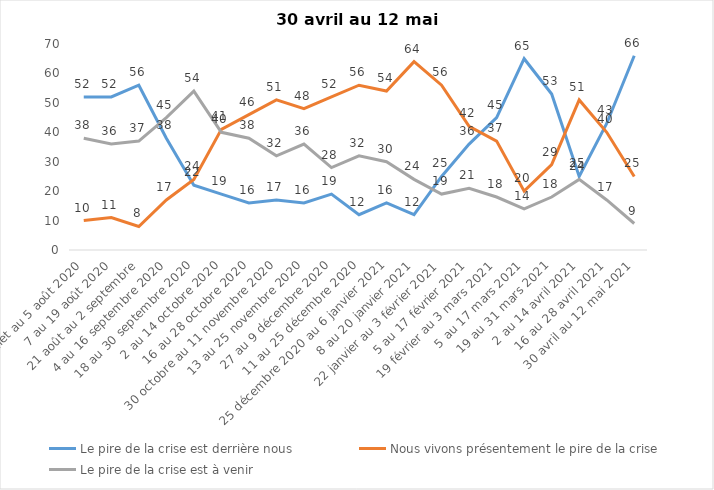
| Category | Le pire de la crise est derrière nous | Nous vivons présentement le pire de la crise | Le pire de la crise est à venir |
|---|---|---|---|
| 24 juillet au 5 août 2020 | 52 | 10 | 38 |
| 7 au 19 août 2020 | 52 | 11 | 36 |
| 21 août au 2 septembre | 56 | 8 | 37 |
| 4 au 16 septembre 2020 | 38 | 17 | 45 |
| 18 au 30 septembre 2020 | 22 | 24 | 54 |
| 2 au 14 octobre 2020 | 19 | 41 | 40 |
| 16 au 28 octobre 2020 | 16 | 46 | 38 |
| 30 octobre au 11 novembre 2020 | 17 | 51 | 32 |
| 13 au 25 novembre 2020 | 16 | 48 | 36 |
| 27 au 9 décembre 2020 | 19 | 52 | 28 |
| 11 au 25 décembre 2020 | 12 | 56 | 32 |
| 25 décembre 2020 au 6 janvier 2021 | 16 | 54 | 30 |
| 8 au 20 janvier 2021 | 12 | 64 | 24 |
| 22 janvier au 3 février 2021 | 25 | 56 | 19 |
| 5 au 17 février 2021 | 36 | 42 | 21 |
| 19 février au 3 mars 2021 | 45 | 37 | 18 |
| 5 au 17 mars 2021 | 65 | 20 | 14 |
| 19 au 31 mars 2021 | 53 | 29 | 18 |
| 2 au 14 avril 2021 | 25 | 51 | 24 |
| 16 au 28 avril 2021 | 43 | 40 | 17 |
| 30 avril au 12 mai 2021 | 66 | 25 | 9 |